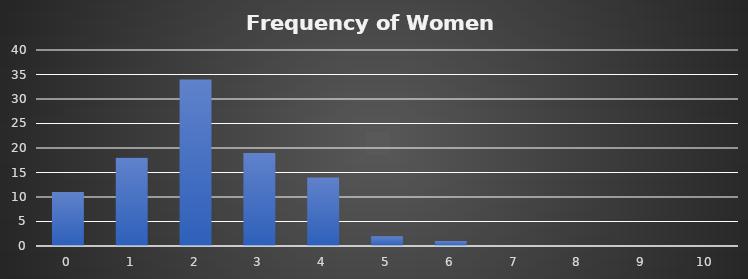
| Category | Series 0 |
|---|---|
| 0.0 | 11 |
| 1.0 | 18 |
| 2.0 | 34 |
| 3.0 | 19 |
| 4.0 | 14 |
| 5.0 | 2 |
| 6.0 | 1 |
| 7.0 | 0 |
| 8.0 | 0 |
| 9.0 | 0 |
| 10.0 | 0 |